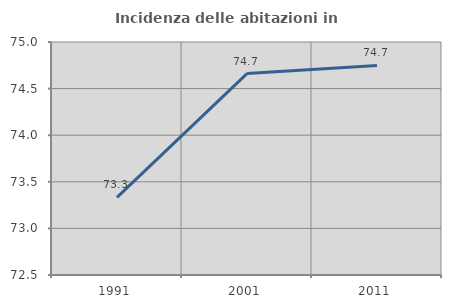
| Category | Incidenza delle abitazioni in proprietà  |
|---|---|
| 1991.0 | 73.333 |
| 2001.0 | 74.661 |
| 2011.0 | 74.749 |